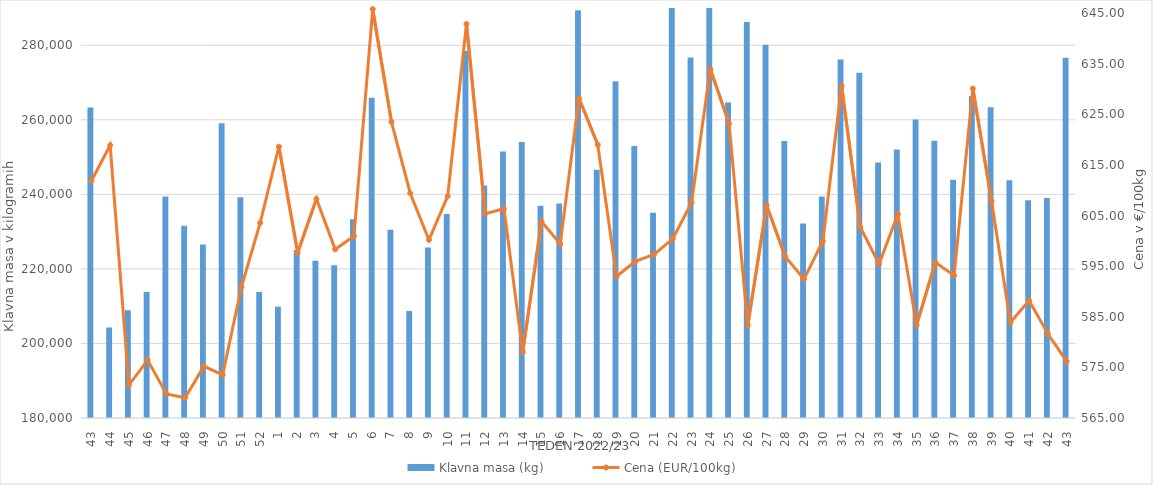
| Category | Klavna masa (kg) |
|---|---|
| 43.0 | 263287 |
| 44.0 | 204280 |
| 45.0 | 208920 |
| 46.0 | 213836 |
| 47.0 | 239417 |
| 48.0 | 231565 |
| 49.0 | 226575 |
| 50.0 | 259073 |
| 51.0 | 239211 |
| 52.0 | 213841 |
| 1.0 | 209877 |
| 2.0 | 225045 |
| 3.0 | 222198 |
| 4.0 | 221002 |
| 5.0 | 233306 |
| 6.0 | 265944 |
| 7.0 | 230531 |
| 8.0 | 208699 |
| 9.0 | 225712 |
| 10.0 | 234762 |
| 11.0 | 278467 |
| 12.0 | 242369 |
| 13.0 | 251507 |
| 14.0 | 254072 |
| 15.0 | 236964 |
| 16.0 | 237552 |
| 17.0 | 289400 |
| 18.0 | 246616 |
| 19.0 | 270374 |
| 20.0 | 252984 |
| 21.0 | 235060 |
| 22.0 | 290816 |
| 23.0 | 276702 |
| 24.0 | 292976 |
| 25.0 | 264669 |
| 26.0 | 286237 |
| 27.0 | 280112 |
| 28.0 | 254336 |
| 29.0 | 232178 |
| 30.0 | 239437 |
| 31.0 | 276163 |
| 32.0 | 272647 |
| 33.0 | 248536 |
| 34.0 | 252050 |
| 35.0 | 260110 |
| 36.0 | 254389 |
| 37.0 | 243933 |
| 38.0 | 266321 |
| 39.0 | 263346 |
| 40.0 | 243765 |
| 41.0 | 238404 |
| 42.0 | 239007 |
| 43.0 | 276684 |